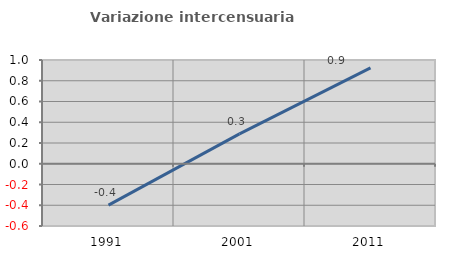
| Category | Variazione intercensuaria annua |
|---|---|
| 1991.0 | -0.399 |
| 2001.0 | 0.288 |
| 2011.0 | 0.924 |